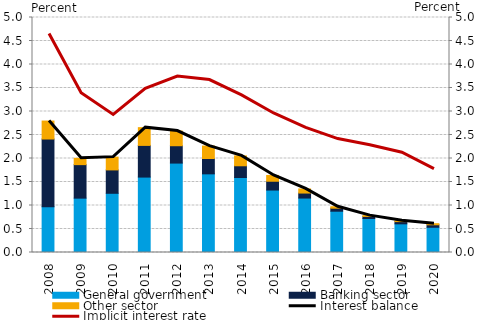
| Category | General government | Banking sector | Other sector |
|---|---|---|---|
| 0 | 0.976 | 1.439 | 0.382 |
| 1 | 1.157 | 0.713 | 0.134 |
| 2 | 1.26 | 0.497 | 0.272 |
| 3 | 1.605 | 0.674 | 0.378 |
| 4 | 1.902 | 0.369 | 0.312 |
| 5 | 1.674 | 0.327 | 0.264 |
| 6 | 1.595 | 0.25 | 0.21 |
| 7 | 1.329 | 0.187 | 0.123 |
| 8 | 1.158 | 0.106 | 0.088 |
| 9 | 0.878 | 0.064 | 0.031 |
| 10 | 0.723 | 0.045 | 0.017 |
| 11 | 0.61 | 0.047 | 0.018 |
| 12 | 0.537 | 0.053 | 0.023 |